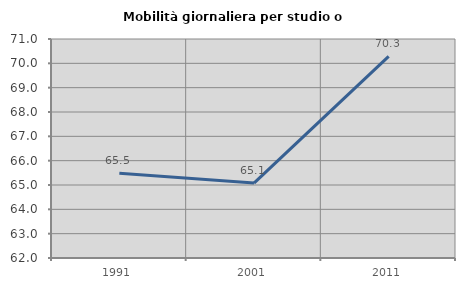
| Category | Mobilità giornaliera per studio o lavoro |
|---|---|
| 1991.0 | 65.481 |
| 2001.0 | 65.08 |
| 2011.0 | 70.285 |